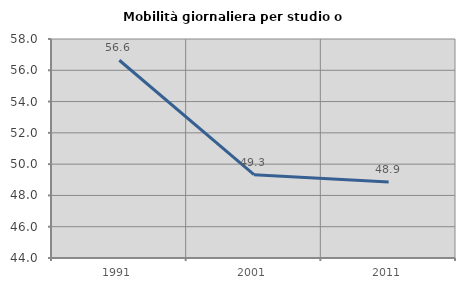
| Category | Mobilità giornaliera per studio o lavoro |
|---|---|
| 1991.0 | 56.642 |
| 2001.0 | 49.324 |
| 2011.0 | 48.862 |